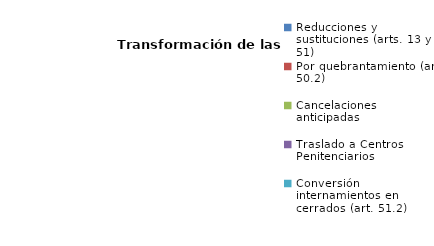
| Category | Series 0 |
|---|---|
| Reducciones y sustituciones (arts. 13 y 51) | 0 |
| Por quebrantamiento (art. 50.2) | 0 |
| Cancelaciones anticipadas | 0 |
| Traslado a Centros Penitenciarios | 0 |
| Conversión internamientos en cerrados (art. 51.2) | 0 |